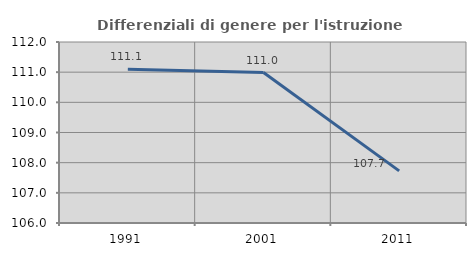
| Category | Differenziali di genere per l'istruzione superiore |
|---|---|
| 1991.0 | 111.095 |
| 2001.0 | 110.988 |
| 2011.0 | 107.727 |